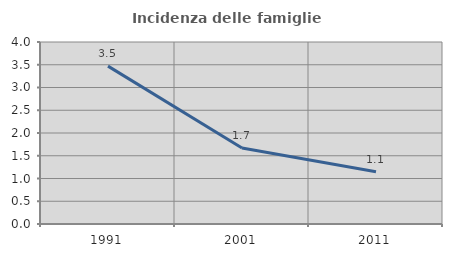
| Category | Incidenza delle famiglie numerose |
|---|---|
| 1991.0 | 3.469 |
| 2001.0 | 1.672 |
| 2011.0 | 1.149 |